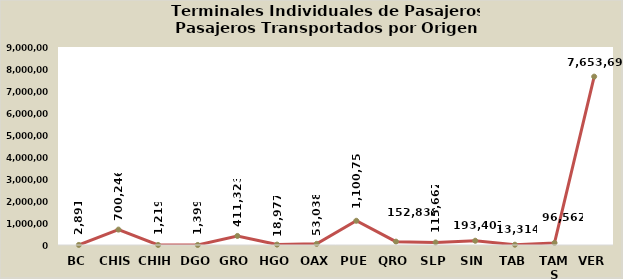
| Category | Total general |
|---|---|
| BC | 2891 |
| CHIS | 700246 |
| CHIH | 1219 |
| DGO | 1399 |
| GRO | 411323 |
| HGO | 18977 |
| OAX | 53038 |
| PUE | 1100755 |
| QRO | 152838 |
| SLP | 115662 |
| SIN | 193407 |
| TAB | 13314 |
| TAMS | 96562 |
| VER | 7653699 |